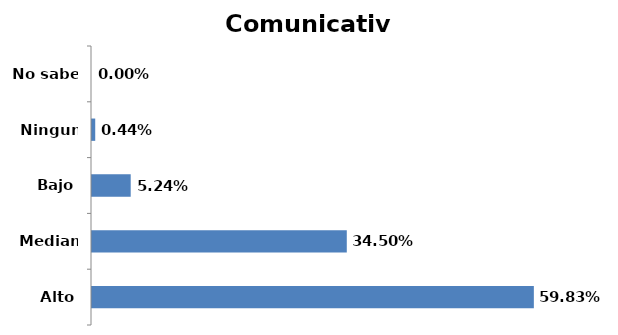
| Category | Series 0 |
|---|---|
| Alto | 0.598 |
| Mediano | 0.345 |
| Bajo | 0.052 |
| Ninguno | 0.004 |
| No sabe | 0 |